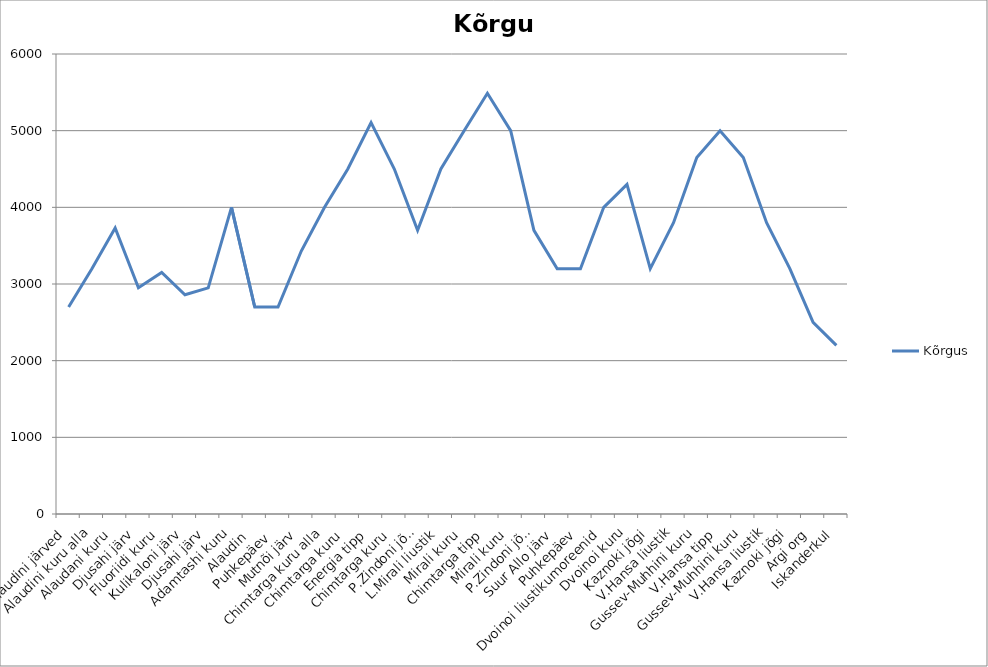
| Category | Kõrgus |
|---|---|
| Alaudini järved | 2700 |
| Alaudini kuru alla | 3200 |
| Alaudani kuru  | 3730 |
| Djusahi järv | 2950 |
| Fluoriidi kuru | 3150 |
| Kulikaloni järv | 2860 |
| Djusahi järv | 2950 |
| Adamtashi kuru | 4000 |
| Alaudin  | 2700 |
| Puhkepäev  | 2700 |
| Mutnõi järv | 3430 |
| Chimtarga kuru alla | 4000 |
| Chimtarga kuru | 4500 |
| Energia tipp | 5105 |
| Chimtarga kuru | 4500 |
| P.Zindoni jõgi | 3700 |
| L.Mirali liustik | 4500 |
| Mirali kuru | 5000 |
| Chimtarga tipp | 5487 |
| Mirali kuru | 5000 |
| P.Zindoni jõgi | 3700 |
| Suur Allo järv | 3200 |
| Puhkepäev | 3200 |
| Dvoinoi liustikumoreenid | 4000 |
| Dvoinoi kuru | 4300 |
| Kaznoki jõgi | 3200 |
| V.Hansa liustik | 3800 |
| Gussev-Muhhini kuru | 4650 |
| V.Hansa tipp | 5000 |
| Gussev-Muhhini kuru | 4650 |
| V.Hansa liustik | 3800 |
| Kaznoki jõgi | 3200 |
| Argi org | 2500 |
| Iskanderkul | 2200 |